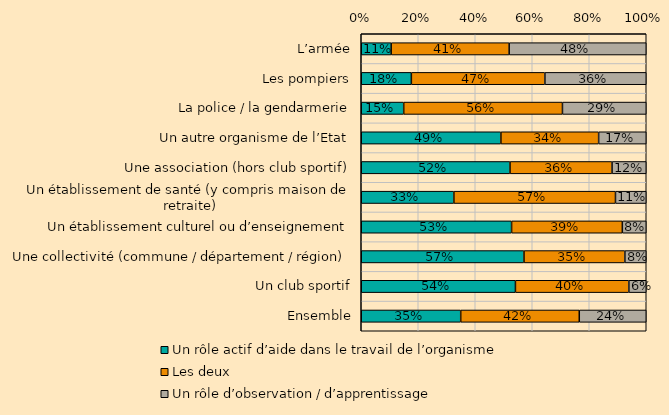
| Category | Un rôle actif d’aide dans le travail de l’organisme | Les deux | Un rôle d’observation / d’apprentissage |
|---|---|---|---|
| L’armée | 0.105 | 0.414 | 0.481 |
| Les pompiers | 0.176 | 0.469 | 0.356 |
| La police / la gendarmerie | 0.149 | 0.557 | 0.294 |
| Un autre organisme de l’Etat | 0.49 | 0.343 | 0.167 |
| Une association (hors club sportif) | 0.522 | 0.358 | 0.12 |
| Un établissement de santé (y compris maison de retraite) | 0.325 | 0.567 | 0.108 |
| Un établissement culturel ou d’enseignement | 0.528 | 0.389 | 0.084 |
| Une collectivité (commune / département / région) | 0.571 | 0.354 | 0.075 |
| Un club sportif | 0.541 | 0.398 | 0.061 |
| Ensemble | 0.349 | 0.416 | 0.235 |